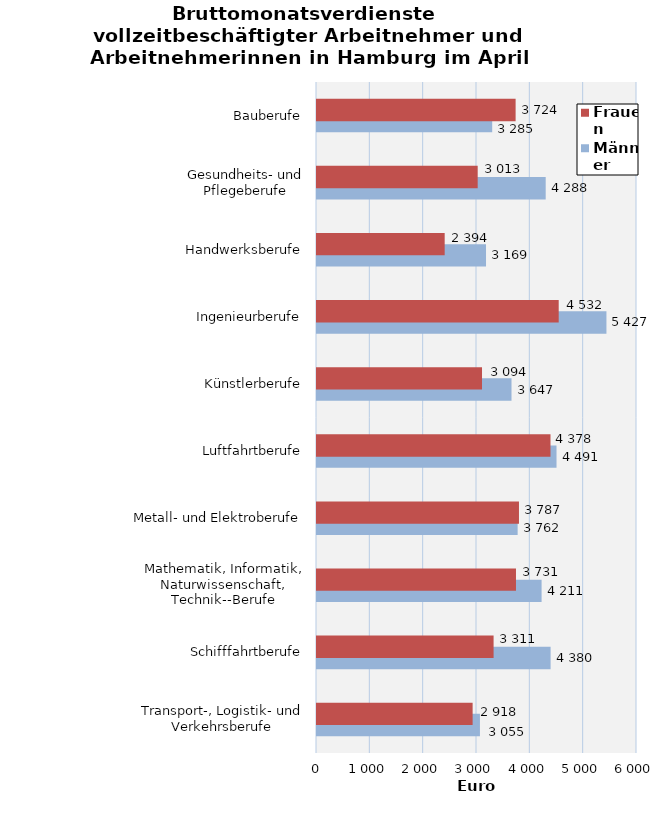
| Category | Männer | Frauen |
|---|---|---|
| Transport-, Logistik- und Verkehrsberufe | 3055 | 2918 |
| Schifffahrtberufe | 4380 | 3311 |
| Mathematik, Informatik, Naturwissenschaft, Technik--Berufe | 4211 | 3731 |
| Metall- und Elektroberufe | 3762 | 3787 |
| Luftfahrtberufe | 4491 | 4378 |
| Künstlerberufe | 3647 | 3094 |
| Ingenieurberufe | 5427 | 4532 |
| Handwerksberufe | 3169 | 2394 |
| Gesundheits- und Pflegeberufe | 4288 | 3013 |
| Bauberufe | 3285 | 3724 |